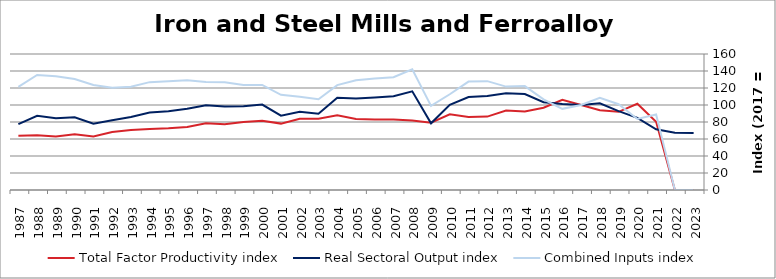
| Category | Total Factor Productivity index | Real Sectoral Output index | Combined Inputs index |
|---|---|---|---|
| 2023.0 | 0 | 67.155 | 0 |
| 2022.0 | 0 | 67.426 | 0 |
| 2021.0 | 80.363 | 71.396 | 88.842 |
| 2020.0 | 101.456 | 84.849 | 83.631 |
| 2019.0 | 91.976 | 92.818 | 100.916 |
| 2018.0 | 93.876 | 101.937 | 108.587 |
| 2017.0 | 100 | 100 | 100 |
| 2016.0 | 106.021 | 101.248 | 95.497 |
| 2015.0 | 96.831 | 103.201 | 106.578 |
| 2014.0 | 92.326 | 112.836 | 122.215 |
| 2013.0 | 93.568 | 113.834 | 121.659 |
| 2012.0 | 86.368 | 110.608 | 128.066 |
| 2011.0 | 85.751 | 109.396 | 127.574 |
| 2010.0 | 89.014 | 100.255 | 112.629 |
| 2009.0 | 79.25 | 78.448 | 98.988 |
| 2008.0 | 81.738 | 116.101 | 142.04 |
| 2007.0 | 83.032 | 110.202 | 132.723 |
| 2006.0 | 82.946 | 108.798 | 131.168 |
| 2005.0 | 83.535 | 107.787 | 129.032 |
| 2004.0 | 87.874 | 108.447 | 123.411 |
| 2003.0 | 83.884 | 89.615 | 106.833 |
| 2002.0 | 83.904 | 92.09 | 109.757 |
| 2001.0 | 78.109 | 87.502 | 112.026 |
| 2000.0 | 81.387 | 100.548 | 123.544 |
| 1999.0 | 79.871 | 98.638 | 123.497 |
| 1998.0 | 77.351 | 98.145 | 126.882 |
| 1997.0 | 78.468 | 99.789 | 127.172 |
| 1996.0 | 74.04 | 95.504 | 128.99 |
| 1995.0 | 72.604 | 92.787 | 127.799 |
| 1994.0 | 71.878 | 91.207 | 126.892 |
| 1993.0 | 70.652 | 85.773 | 121.402 |
| 1992.0 | 68.116 | 81.978 | 120.351 |
| 1991.0 | 63.029 | 77.921 | 123.627 |
| 1990.0 | 65.502 | 85.594 | 130.674 |
| 1989.0 | 63.087 | 84.496 | 133.935 |
| 1988.0 | 64.439 | 87.257 | 135.41 |
| 1987.0 | 63.811 | 77.406 | 121.305 |